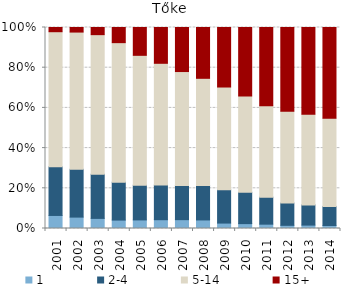
| Category | 1 | 2-4 | 5-14 | 15+ |
|---|---|---|---|---|
| 2001.0 | 6.489 | 24.189 | 67.225 | 2.097 |
| 2002.0 | 5.665 | 23.8 | 68.261 | 2.274 |
| 2003.0 | 5.027 | 21.957 | 69.456 | 3.56 |
| 2004.0 | 4.194 | 18.84 | 69.43 | 7.536 |
| 2005.0 | 4.274 | 17.25 | 64.633 | 13.843 |
| 2006.0 | 4.373 | 17.232 | 60.587 | 17.808 |
| 2007.0 | 4.399 | 17.022 | 56.667 | 21.913 |
| 2008.0 | 4.256 | 17.13 | 53.335 | 25.279 |
| 2009.0 | 2.694 | 16.626 | 51.068 | 29.612 |
| 2010.0 | 2.427 | 15.568 | 47.897 | 34.108 |
| 2011.0 | 2.153 | 13.432 | 45.487 | 38.927 |
| 2012.0 | 1.576 | 11.097 | 45.599 | 41.729 |
| 2013.0 | 1.683 | 10.059 | 45.052 | 43.206 |
| 2014.0 | 1.504 | 9.474 | 43.917 | 45.104 |